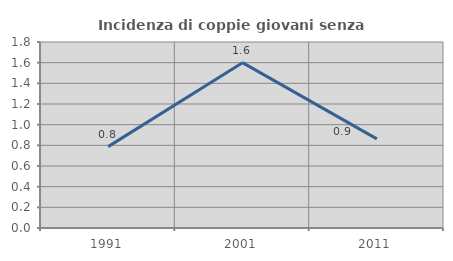
| Category | Incidenza di coppie giovani senza figli |
|---|---|
| 1991.0 | 0.787 |
| 2001.0 | 1.6 |
| 2011.0 | 0.862 |